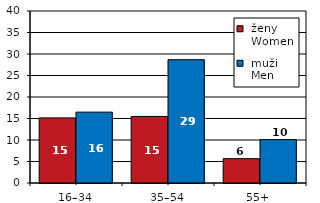
| Category |  ženy 
 Women |  muži 
 Men |
|---|---|---|
| 16–34 | 15.142 | 16.479 |
| 35–54 | 15.48 | 28.68 |
| 55+  | 5.657 | 10.085 |